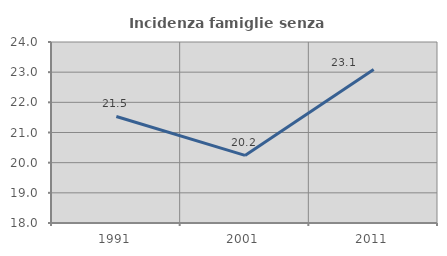
| Category | Incidenza famiglie senza nuclei |
|---|---|
| 1991.0 | 21.532 |
| 2001.0 | 20.24 |
| 2011.0 | 23.092 |